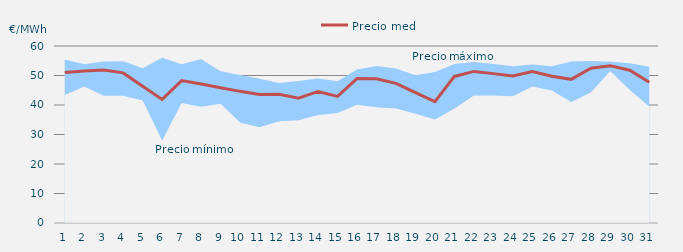
| Category | Precio medio |
|---|---|
| 1.0 | 51.012 |
| 2.0 | 51.509 |
| 3.0 | 51.891 |
| 4.0 | 50.884 |
| 5.0 | 46.369 |
| 6.0 | 41.882 |
| 7.0 | 48.261 |
| 8.0 | 47.124 |
| 9.0 | 45.873 |
| 10.0 | 44.625 |
| 11.0 | 43.542 |
| 12.0 | 43.647 |
| 13.0 | 42.293 |
| 14.0 | 44.591 |
| 15.0 | 42.907 |
| 16.0 | 48.94 |
| 17.0 | 48.885 |
| 18.0 | 47.351 |
| 19.0 | 44.218 |
| 20.0 | 41.171 |
| 21.0 | 49.682 |
| 22.0 | 51.391 |
| 23.0 | 50.636 |
| 24.0 | 49.814 |
| 25.0 | 51.328 |
| 26.0 | 49.733 |
| 27.0 | 48.707 |
| 28.0 | 52.437 |
| 29.0 | 53.329 |
| 30.0 | 51.791 |
| 31.0 | 47.694 |